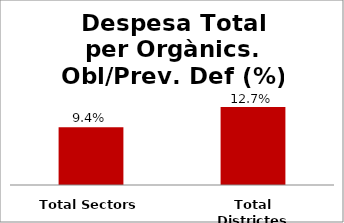
| Category | Series 0 |
|---|---|
| Total Sectors | 0.094 |
| Total Districtes | 0.127 |